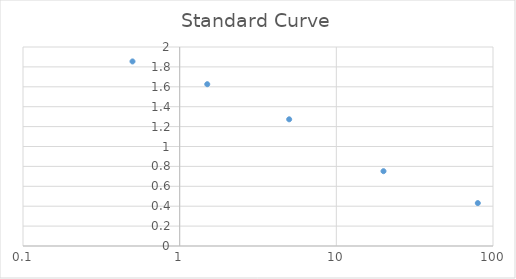
| Category | Series 0 |
|---|---|
| 80.0 | 0.431 |
| 20.0 | 0.752 |
| 5.0 | 1.273 |
| 1.5 | 1.626 |
| 0.5 | 1.855 |